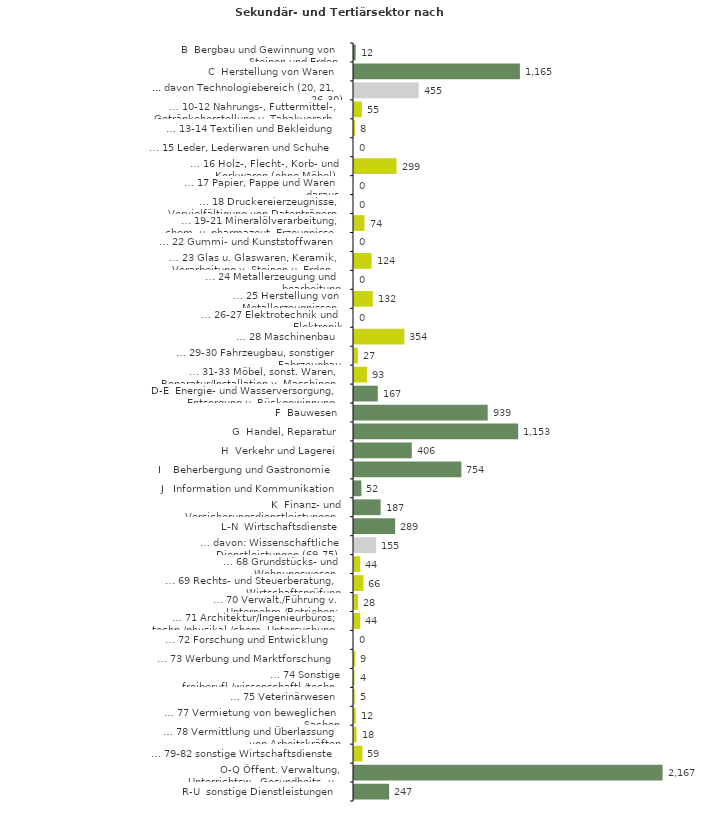
| Category | Series 0 |
|---|---|
| B  Bergbau und Gewinnung von Steinen und Erden | 12 |
| C  Herstellung von Waren | 1165 |
| ... davon Technologiebereich (20, 21, 26-30) | 455 |
| … 10-12 Nahrungs-, Futtermittel-, Getränkeherstellung u. Tabakverarb. | 55 |
| … 13-14 Textilien und Bekleidung | 8 |
| … 15 Leder, Lederwaren und Schuhe | 0 |
| … 16 Holz-, Flecht-, Korb- und Korkwaren (ohne Möbel)  | 299 |
| … 17 Papier, Pappe und Waren daraus  | 0 |
| … 18 Druckereierzeugnisse, Vervielfältigung von Datenträgern | 0 |
| … 19-21 Mineralölverarbeitung, chem. u. pharmazeut. Erzeugnisse | 74 |
| … 22 Gummi- und Kunststoffwaren | 0 |
| … 23 Glas u. Glaswaren, Keramik, Verarbeitung v. Steinen u. Erden  | 124 |
| … 24 Metallerzeugung und -bearbeitung | 0 |
| … 25 Herstellung von Metallerzeugnissen  | 132 |
| … 26-27 Elektrotechnik und Elektronik | 0 |
| … 28 Maschinenbau | 354 |
| … 29-30 Fahrzeugbau, sonstiger Fahrzeugbau | 27 |
| … 31-33 Möbel, sonst. Waren, Reparatur/Installation v. Maschinen | 93 |
| D-E  Energie- und Wasserversorgung, Entsorgung u. Rückgewinnung | 167 |
| F  Bauwesen | 939 |
| G  Handel, Reparatur | 1153 |
| H  Verkehr und Lagerei | 406 |
| I    Beherbergung und Gastronomie | 754 |
| J   Information und Kommunikation | 52 |
| K  Finanz- und Versicherungsdienstleistungen | 187 |
| L-N  Wirtschaftsdienste | 289 |
| … davon: Wissenschaftliche Dienstleistungen (69-75) | 155 |
| … 68 Grundstücks- und Wohnungswesen  | 44 |
| … 69 Rechts- und Steuerberatung, Wirtschaftsprüfung | 66 |
| … 70 Verwalt./Führung v. Unternehm./Betrieben; Unternehmensberat. | 28 |
| … 71 Architektur/Ingenieurbüros; techn./physikal./chem. Untersuchung | 44 |
| … 72 Forschung und Entwicklung  | 0 |
| … 73 Werbung und Marktforschung | 9 |
| … 74 Sonstige freiberufl./wissenschaftl./techn. Tätigkeiten | 4 |
| … 75 Veterinärwesen | 5 |
| … 77 Vermietung von beweglichen Sachen  | 12 |
| … 78 Vermittlung und Überlassung von Arbeitskräften | 18 |
| … 79-82 sonstige Wirtschaftsdienste | 59 |
| O-Q Öffent. Verwaltung, Unterrichtsw., Gesundheits- u. Sozialwesen | 2167 |
| R-U  sonstige Dienstleistungen | 247 |